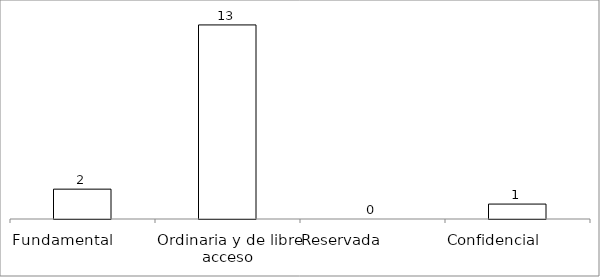
| Category | Series 0 |
|---|---|
| Fundamental         | 2 |
| Ordinaria y de libre acceso | 13 |
| Reservada               | 0 |
| Confidencial             | 1 |